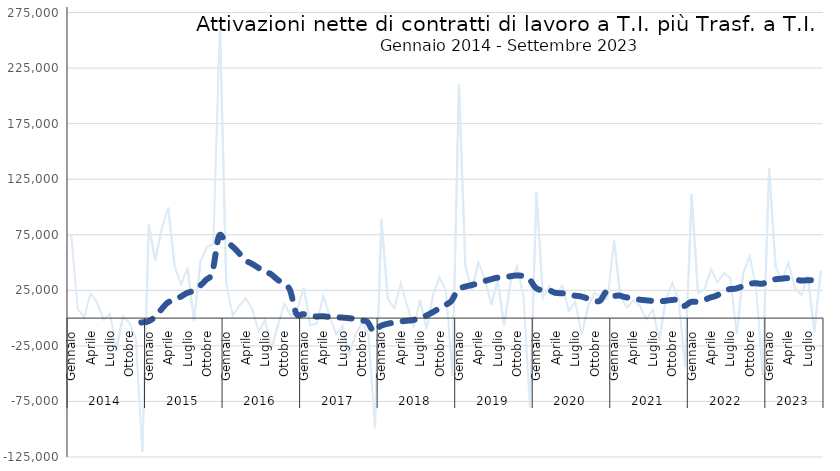
| Category | T.I. + Trasf. da T.D. |
|---|---|
| 0 | 74789 |
| 1 | 8218 |
| 2 | 550 |
| 3 | 22329 |
| 4 | 13996 |
| 5 | -1413 |
| 6 | 3957 |
| 7 | -27632 |
| 8 | 1456 |
| 9 | -4062 |
| 10 | -18528 |
| 11 | -120493 |
| 12 | 84060 |
| 13 | 51890 |
| 14 | 80139 |
| 15 | 99752 |
| 16 | 46719 |
| 17 | 30276 |
| 18 | 45141 |
| 19 | -2230 |
| 20 | 51155 |
| 21 | 63927 |
| 22 | 66924 |
| 23 | 265258 |
| 24 | 31025 |
| 25 | 2501 |
| 26 | 11006 |
| 27 | 17866 |
| 28 | 8208 |
| 29 | -11870 |
| 30 | -1838 |
| 31 | -27172 |
| 32 | -6299 |
| 33 | 13093 |
| 34 | 1813 |
| 35 | 8290 |
| 36 | 27527 |
| 37 | -6518 |
| 38 | -4848 |
| 39 | 19971 |
| 40 | 1900 |
| 41 | -14560 |
| 42 | -6967 |
| 43 | -33042 |
| 44 | -14916 |
| 45 | -3686 |
| 46 | -14652 |
| 47 | -98145 |
| 48 | 88681 |
| 49 | 17033 |
| 50 | 8923 |
| 51 | 31102 |
| 52 | 11175 |
| 53 | -7763 |
| 54 | 15977 |
| 55 | -9461 |
| 56 | 20739 |
| 57 | 36654 |
| 58 | 24770 |
| 59 | -51833 |
| 60 | 210678 |
| 61 | 46637 |
| 62 | 25735 |
| 63 | 49897 |
| 64 | 35439 |
| 65 | 12129 |
| 66 | 33960 |
| 67 | -6467 |
| 68 | 32910 |
| 69 | 46463 |
| 70 | 19419 |
| 71 | -80720 |
| 72 | 113639 |
| 73 | 18431 |
| 74 | 28339 |
| 75 | 21119 |
| 76 | 29265 |
| 77 | 6548 |
| 78 | 14621 |
| 79 | -15003 |
| 80 | 10969 |
| 81 | 22618 |
| 82 | 18692 |
| 83 | 16902 |
| 84 | 70058 |
| 85 | 19139 |
| 86 | 9548 |
| 87 | 15858 |
| 88 | 10814 |
| 89 | -1310 |
| 90 | 7709 |
| 91 | -20581 |
| 92 | 16532 |
| 93 | 31518 |
| 94 | 16464 |
| 95 | -43926 |
| 96 | 111420 |
| 97 | 22581 |
| 98 | 25511 |
| 99 | 44046 |
| 100 | 32155 |
| 101 | 40523 |
| 102 | 35880 |
| 103 | -14477 |
| 104 | 40334 |
| 105 | 55884 |
| 106 | 27609 |
| 107 | -51234 |
| 108 | 134869 |
| 109 | 46310 |
| 110 | 33709 |
| 111 | 49791 |
| 112 | 26966 |
| 113 | 20595 |
| 114 | 38358 |
| 115 | -12331 |
| 116 | 42934 |